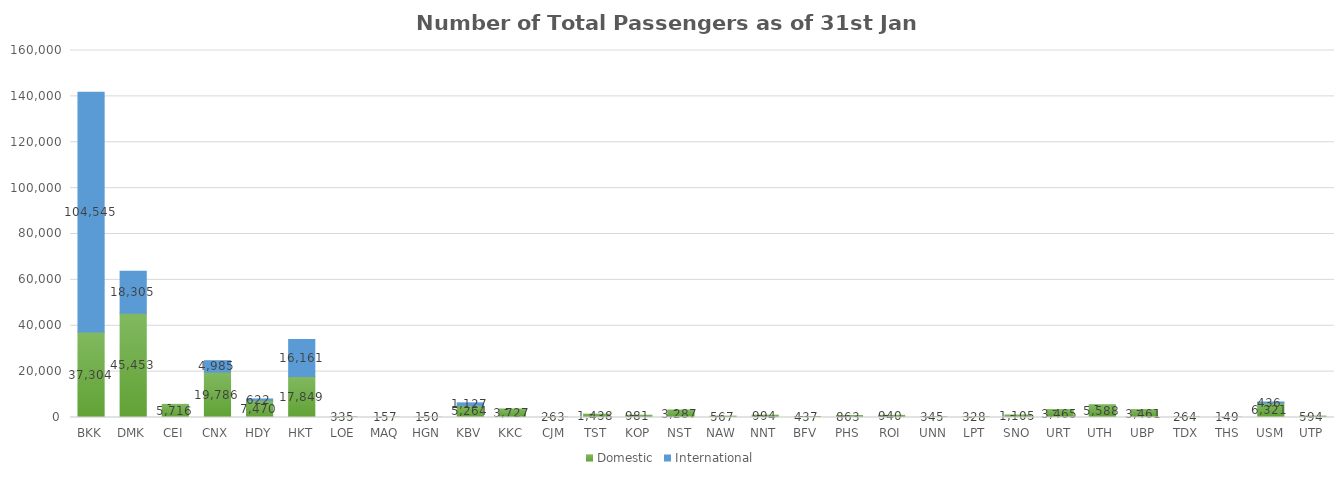
| Category | Domestic | International |
|---|---|---|
| BKK | 37304 | 104545 |
| DMK | 45453 | 18305 |
| CEI | 5716 | 0 |
| CNX | 19786 | 4985 |
| HDY | 7470 | 622 |
| HKT | 17849 | 16161 |
| LOE | 335 | 0 |
| MAQ | 157 | 0 |
| HGN | 150 | 0 |
| KBV | 5264 | 1127 |
| KKC | 3727 | 0 |
| CJM | 263 | 0 |
| TST | 1438 | 0 |
| KOP | 981 | 0 |
| NST | 3287 | 0 |
| NAW | 567 | 0 |
| NNT | 994 | 0 |
| BFV | 437 | 0 |
| PHS | 863 | 0 |
| ROI | 940 | 0 |
| UNN | 345 | 0 |
| LPT | 328 | 0 |
| SNO | 1105 | 0 |
| URT | 3465 | 0 |
| UTH | 5588 | 0 |
| UBP | 3461 | 0 |
| TDX | 264 | 0 |
| THS | 149 | 0 |
| USM | 6321 | 436 |
| UTP | 594 | 0 |